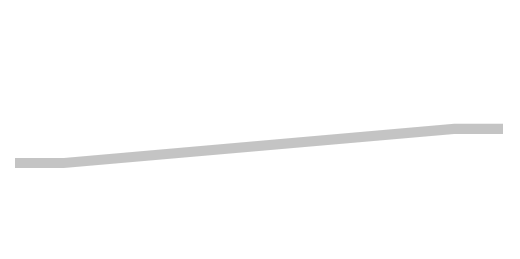
| Category | S1 | S2 | S3 |
|---|---|---|---|
| 0.0 | 1180 | 90 | 660 |
| 10.0 | 1180 | 90 | 660 |
| 90.0 | 880 | 90 | 960 |
| 100.0 | 880 | 90 | 960 |